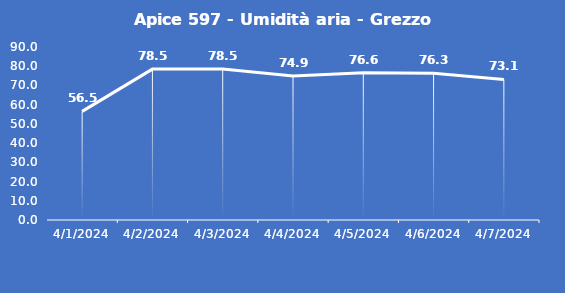
| Category | Apice 597 - Umidità aria - Grezzo (%) |
|---|---|
| 4/1/24 | 56.5 |
| 4/2/24 | 78.5 |
| 4/3/24 | 78.5 |
| 4/4/24 | 74.9 |
| 4/5/24 | 76.6 |
| 4/6/24 | 76.3 |
| 4/7/24 | 73.1 |